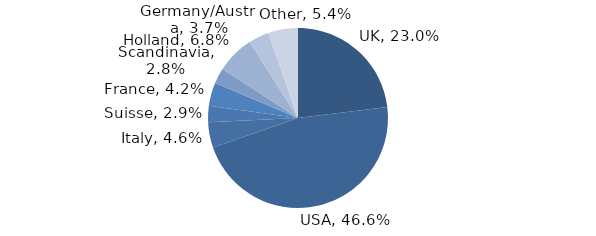
| Category | Investment Style |
|---|---|
| UK | 0.23 |
| USA | 0.466 |
| Italy | 0.046 |
| Suisse | 0.029 |
| France | 0.042 |
| Scandinavia | 0.028 |
| Holland | 0.068 |
| Germany/Austria | 0.037 |
| Other | 0.054 |